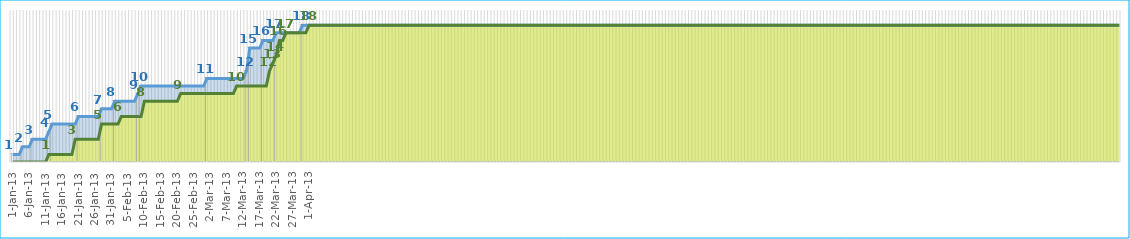
| Category | Create Label | Close Label |
|---|---|---|
| 0 | 1 | 0 |
| 1900-01-01 | 0 | 0 |
| 1900-01-02 | 0 | 0 |
| 1900-01-03 | 2 | 0 |
| 1900-01-04 | 0 | 0 |
| 1900-01-05 | 0 | 0 |
| 1900-01-06 | 3 | 0 |
| 1900-01-07 | 0 | 0 |
| 1900-01-08 | 0 | 0 |
| 1900-01-09 | 0 | 0 |
| 1900-01-10 | 0 | 0 |
| 1900-01-11 | 4 | 1 |
| 1900-01-12 | 5 | 0 |
| 1900-01-13 | 0 | 0 |
| 1900-01-14 | 0 | 0 |
| 1900-01-15 | 0 | 0 |
| 1900-01-16 | 0 | 0 |
| 1900-01-17 | 0 | 0 |
| 1900-01-18 | 0 | 0 |
| 1900-01-19 | 0 | 3 |
| 1900-01-20 | 6 | 0 |
| 1900-01-21 | 0 | 0 |
| 1900-01-22 | 0 | 0 |
| 1900-01-23 | 0 | 0 |
| 1900-01-24 | 0 | 0 |
| 1900-01-25 | 0 | 0 |
| 1900-01-26 | 0 | 0 |
| 1900-01-27 | 7 | 5 |
| 1900-01-28 | 0 | 0 |
| 1900-01-29 | 0 | 0 |
| 1900-01-30 | 0 | 0 |
| 1900-01-31 | 8 | 0 |
| 1900-02-01 | 0 | 0 |
| 1900-02-02 | 0 | 6 |
| 1900-02-03 | 0 | 0 |
| 1900-02-04 | 0 | 0 |
| 1900-02-05 | 0 | 0 |
| 1900-02-06 | 0 | 0 |
| 1900-02-07 | 9 | 0 |
| 1900-02-08 | 10 | 0 |
| 1900-02-09 | 0 | 8 |
| 1900-02-10 | 0 | 0 |
| 1900-02-11 | 0 | 0 |
| 1900-02-12 | 0 | 0 |
| 1900-02-13 | 0 | 0 |
| 1900-02-14 | 0 | 0 |
| 1900-02-15 | 0 | 0 |
| 1900-02-16 | 0 | 0 |
| 1900-02-17 | 0 | 0 |
| 1900-02-18 | 0 | 0 |
| 1900-02-19 | 0 | 0 |
| 1900-02-20 | 0 | 9 |
| 1900-02-21 | 0 | 0 |
| 1900-02-22 | 0 | 0 |
| 1900-02-23 | 0 | 0 |
| 1900-02-24 | 0 | 0 |
| 1900-02-25 | 0 | 0 |
| 1900-02-26 | 0 | 0 |
| 1900-02-27 | 0 | 0 |
| 1900-02-28 | 11 | 0 |
| 1900-02-28 | 0 | 0 |
| 1900-03-01 | 0 | 0 |
| 1900-03-02 | 0 | 0 |
| 1900-03-03 | 0 | 0 |
| 1900-03-04 | 0 | 0 |
| 1900-03-05 | 0 | 0 |
| 1900-03-06 | 0 | 0 |
| 1900-03-07 | 0 | 0 |
| 1900-03-08 | 0 | 10 |
| 1900-03-09 | 0 | 0 |
| 1900-03-10 | 0 | 0 |
| 1900-03-11 | 12 | 0 |
| 1900-03-12 | 15 | 0 |
| 1900-03-13 | 0 | 0 |
| 1900-03-14 | 0 | 0 |
| 1900-03-15 | 0 | 0 |
| 1900-03-16 | 16 | 0 |
| 1900-03-17 | 0 | 0 |
| 1900-03-18 | 0 | 12 |
| 1900-03-19 | 0 | 13 |
| 1900-03-20 | 17 | 14 |
| 1900-03-21 | 0 | 16 |
| 1900-03-22 | 0 | 0 |
| 1900-03-23 | 0 | 17 |
| 1900-03-24 | 0 | 0 |
| 1900-03-25 | 0 | 0 |
| 1900-03-26 | 0 | 0 |
| 1900-03-27 | 0 | 0 |
| 1900-03-28 | 18 | 0 |
| 1900-03-29 | 0 | 0 |
| 1900-03-30 | 0 | 18 |
| 1900-03-31 | 0 | 0 |
| 1900-04-01 | 0 | 0 |
| 1900-04-02 | 0 | 0 |
| 1900-04-03 | 0 | 0 |
| 1900-04-04 | 0 | 0 |
| 1900-04-05 | 0 | 0 |
| 1900-04-06 | 0 | 0 |
| 1900-04-07 | 0 | 0 |
| 1900-04-08 | 0 | 0 |
| 1900-04-09 | 0 | 0 |
| 1900-04-10 | 0 | 0 |
| 1900-04-11 | 0 | 0 |
| 1900-04-12 | 0 | 0 |
| 1900-04-13 | 0 | 0 |
| 1900-04-14 | 0 | 0 |
| 1900-04-15 | 0 | 0 |
| 1900-04-16 | 0 | 0 |
| 1900-04-17 | 0 | 0 |
| 1900-04-18 | 0 | 0 |
| 1900-04-19 | 0 | 0 |
| 1900-04-20 | 0 | 0 |
| 1900-04-21 | 0 | 0 |
| 1900-04-22 | 0 | 0 |
| 1900-04-23 | 0 | 0 |
| 1900-04-24 | 0 | 0 |
| 1900-04-25 | 0 | 0 |
| 1900-04-26 | 0 | 0 |
| 1900-04-27 | 0 | 0 |
| 1900-04-28 | 0 | 0 |
| 1900-04-29 | 0 | 0 |
| 1900-04-30 | 0 | 0 |
| 1900-05-01 | 0 | 0 |
| 1900-05-02 | 0 | 0 |
| 1900-05-03 | 0 | 0 |
| 1900-05-04 | 0 | 0 |
| 1900-05-05 | 0 | 0 |
| 1900-05-06 | 0 | 0 |
| 1900-05-07 | 0 | 0 |
| 1900-05-08 | 0 | 0 |
| 1900-05-09 | 0 | 0 |
| 1900-05-10 | 0 | 0 |
| 1900-05-11 | 0 | 0 |
| 1900-05-12 | 0 | 0 |
| 1900-05-13 | 0 | 0 |
| 1900-05-14 | 0 | 0 |
| 1900-05-15 | 0 | 0 |
| 1900-05-16 | 0 | 0 |
| 1900-05-17 | 0 | 0 |
| 1900-05-18 | 0 | 0 |
| 1900-05-19 | 0 | 0 |
| 1900-05-20 | 0 | 0 |
| 1900-05-21 | 0 | 0 |
| 1900-05-22 | 0 | 0 |
| 1900-05-23 | 0 | 0 |
| 1900-05-24 | 0 | 0 |
| 1900-05-25 | 0 | 0 |
| 1900-05-26 | 0 | 0 |
| 1900-05-27 | 0 | 0 |
| 1900-05-28 | 0 | 0 |
| 1900-05-29 | 0 | 0 |
| 1900-05-30 | 0 | 0 |
| 1900-05-31 | 0 | 0 |
| 1900-06-01 | 0 | 0 |
| 1900-06-02 | 0 | 0 |
| 1900-06-03 | 0 | 0 |
| 1900-06-04 | 0 | 0 |
| 1900-06-05 | 0 | 0 |
| 1900-06-06 | 0 | 0 |
| 1900-06-07 | 0 | 0 |
| 1900-06-08 | 0 | 0 |
| 1900-06-09 | 0 | 0 |
| 1900-06-10 | 0 | 0 |
| 1900-06-11 | 0 | 0 |
| 1900-06-12 | 0 | 0 |
| 1900-06-13 | 0 | 0 |
| 1900-06-14 | 0 | 0 |
| 1900-06-15 | 0 | 0 |
| 1900-06-16 | 0 | 0 |
| 1900-06-17 | 0 | 0 |
| 1900-06-18 | 0 | 0 |
| 1900-06-19 | 0 | 0 |
| 1900-06-20 | 0 | 0 |
| 1900-06-21 | 0 | 0 |
| 1900-06-22 | 0 | 0 |
| 1900-06-23 | 0 | 0 |
| 1900-06-24 | 0 | 0 |
| 1900-06-25 | 0 | 0 |
| 1900-06-26 | 0 | 0 |
| 1900-06-27 | 0 | 0 |
| 1900-06-28 | 0 | 0 |
| 1900-06-29 | 0 | 0 |
| 1900-06-30 | 0 | 0 |
| 1900-07-01 | 0 | 0 |
| 1900-07-02 | 0 | 0 |
| 1900-07-03 | 0 | 0 |
| 1900-07-04 | 0 | 0 |
| 1900-07-05 | 0 | 0 |
| 1900-07-06 | 0 | 0 |
| 1900-07-07 | 0 | 0 |
| 1900-07-08 | 0 | 0 |
| 1900-07-09 | 0 | 0 |
| 1900-07-10 | 0 | 0 |
| 1900-07-11 | 0 | 0 |
| 1900-07-12 | 0 | 0 |
| 1900-07-13 | 0 | 0 |
| 1900-07-14 | 0 | 0 |
| 1900-07-15 | 0 | 0 |
| 1900-07-16 | 0 | 0 |
| 1900-07-17 | 0 | 0 |
| 1900-07-18 | 0 | 0 |
| 1900-07-19 | 0 | 0 |
| 1900-07-20 | 0 | 0 |
| 1900-07-21 | 0 | 0 |
| 1900-07-22 | 0 | 0 |
| 1900-07-23 | 0 | 0 |
| 1900-07-24 | 0 | 0 |
| 1900-07-25 | 0 | 0 |
| 1900-07-26 | 0 | 0 |
| 1900-07-27 | 0 | 0 |
| 1900-07-28 | 0 | 0 |
| 1900-07-29 | 0 | 0 |
| 1900-07-30 | 0 | 0 |
| 1900-07-31 | 0 | 0 |
| 1900-08-01 | 0 | 0 |
| 1900-08-02 | 0 | 0 |
| 1900-08-03 | 0 | 0 |
| 1900-08-04 | 0 | 0 |
| 1900-08-05 | 0 | 0 |
| 1900-08-06 | 0 | 0 |
| 1900-08-07 | 0 | 0 |
| 1900-08-08 | 0 | 0 |
| 1900-08-09 | 0 | 0 |
| 1900-08-10 | 0 | 0 |
| 1900-08-11 | 0 | 0 |
| 1900-08-12 | 0 | 0 |
| 1900-08-13 | 0 | 0 |
| 1900-08-14 | 0 | 0 |
| 1900-08-15 | 0 | 0 |
| 1900-08-16 | 0 | 0 |
| 1900-08-17 | 0 | 0 |
| 1900-08-18 | 0 | 0 |
| 1900-08-19 | 0 | 0 |
| 1900-08-20 | 0 | 0 |
| 1900-08-21 | 0 | 0 |
| 1900-08-22 | 0 | 0 |
| 1900-08-23 | 0 | 0 |
| 1900-08-24 | 0 | 0 |
| 1900-08-25 | 0 | 0 |
| 1900-08-26 | 0 | 0 |
| 1900-08-27 | 0 | 0 |
| 1900-08-28 | 0 | 0 |
| 1900-08-29 | 0 | 0 |
| 1900-08-30 | 0 | 0 |
| 1900-08-31 | 0 | 0 |
| 1900-09-01 | 0 | 0 |
| 1900-09-02 | 0 | 0 |
| 1900-09-03 | 0 | 0 |
| 1900-09-04 | 0 | 0 |
| 1900-09-05 | 0 | 0 |
| 1900-09-06 | 0 | 0 |
| 1900-09-07 | 0 | 0 |
| 1900-09-08 | 0 | 0 |
| 1900-09-09 | 0 | 0 |
| 1900-09-10 | 0 | 0 |
| 1900-09-11 | 0 | 0 |
| 1900-09-12 | 0 | 0 |
| 1900-09-13 | 0 | 0 |
| 1900-09-14 | 0 | 0 |
| 1900-09-15 | 0 | 0 |
| 1900-09-16 | 0 | 0 |
| 1900-09-17 | 0 | 0 |
| 1900-09-18 | 0 | 0 |
| 1900-09-19 | 0 | 0 |
| 1900-09-20 | 0 | 0 |
| 1900-09-21 | 0 | 0 |
| 1900-09-22 | 0 | 0 |
| 1900-09-23 | 0 | 0 |
| 1900-09-24 | 0 | 0 |
| 1900-09-25 | 0 | 0 |
| 1900-09-26 | 0 | 0 |
| 1900-09-27 | 0 | 0 |
| 1900-09-28 | 0 | 0 |
| 1900-09-29 | 0 | 0 |
| 1900-09-30 | 0 | 0 |
| 1900-10-01 | 0 | 0 |
| 1900-10-02 | 0 | 0 |
| 1900-10-03 | 0 | 0 |
| 1900-10-04 | 0 | 0 |
| 1900-10-05 | 0 | 0 |
| 1900-10-06 | 0 | 0 |
| 1900-10-07 | 0 | 0 |
| 1900-10-08 | 0 | 0 |
| 1900-10-09 | 0 | 0 |
| 1900-10-10 | 0 | 0 |
| 1900-10-11 | 0 | 0 |
| 1900-10-12 | 0 | 0 |
| 1900-10-13 | 0 | 0 |
| 1900-10-14 | 0 | 0 |
| 1900-10-15 | 0 | 0 |
| 1900-10-16 | 0 | 0 |
| 1900-10-17 | 0 | 0 |
| 1900-10-18 | 0 | 0 |
| 1900-10-19 | 0 | 0 |
| 1900-10-20 | 0 | 0 |
| 1900-10-21 | 0 | 0 |
| 1900-10-22 | 0 | 0 |
| 1900-10-23 | 0 | 0 |
| 1900-10-24 | 0 | 0 |
| 1900-10-25 | 0 | 0 |
| 1900-10-26 | 0 | 0 |
| 1900-10-27 | 0 | 0 |
| 1900-10-28 | 0 | 0 |
| 1900-10-29 | 0 | 0 |
| 1900-10-30 | 0 | 0 |
| 1900-10-31 | 0 | 0 |
| 1900-11-01 | 0 | 0 |
| 1900-11-02 | 0 | 0 |
| 1900-11-03 | 0 | 0 |
| 1900-11-04 | 0 | 0 |
| 1900-11-05 | 0 | 0 |
| 1900-11-06 | 0 | 0 |
| 1900-11-07 | 0 | 0 |
| 1900-11-08 | 0 | 0 |
| 1900-11-09 | 0 | 0 |
| 1900-11-10 | 0 | 0 |
| 1900-11-11 | 0 | 0 |
| 1900-11-12 | 0 | 0 |
| 1900-11-13 | 0 | 0 |
| 1900-11-14 | 0 | 0 |
| 1900-11-15 | 0 | 0 |
| 1900-11-16 | 0 | 0 |
| 1900-11-17 | 0 | 0 |
| 1900-11-18 | 0 | 0 |
| 1900-11-19 | 0 | 0 |
| 1900-11-20 | 0 | 0 |
| 1900-11-21 | 0 | 0 |
| 1900-11-22 | 0 | 0 |
| 1900-11-23 | 0 | 0 |
| 1900-11-24 | 0 | 0 |
| 1900-11-25 | 0 | 0 |
| 1900-11-26 | 0 | 0 |
| 1900-11-27 | 0 | 0 |
| 1900-11-28 | 0 | 0 |
| 1900-11-29 | 0 | 0 |
| 1900-11-30 | 0 | 0 |
| 1900-12-01 | 0 | 0 |